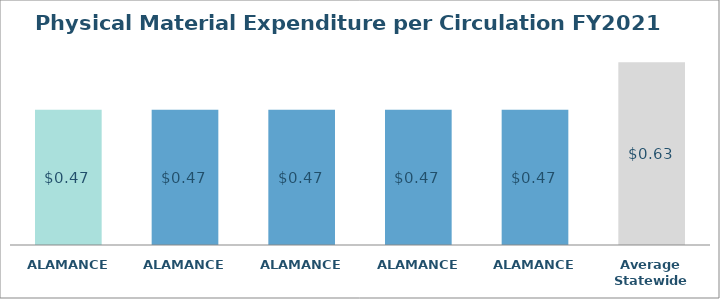
| Category | Series 0 |
|---|---|
| ALAMANCE  | 0.468 |
| ALAMANCE  | 0.468 |
| ALAMANCE  | 0.468 |
| ALAMANCE  | 0.468 |
| ALAMANCE  | 0.468 |
| Average Statewide | 0.633 |